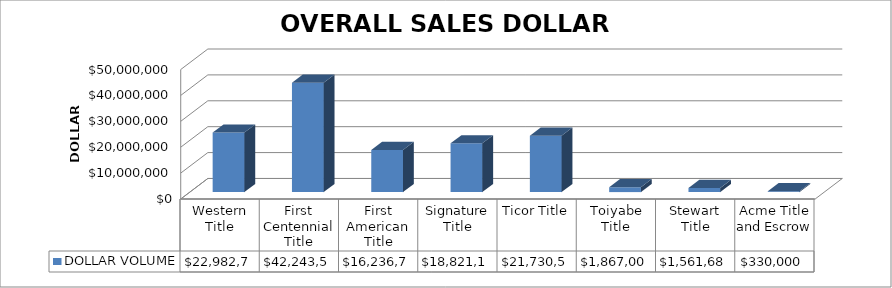
| Category | DOLLAR VOLUME |
|---|---|
| Western Title | 22982786 |
| First Centennial Title | 42243500 |
| First American Title | 16236707 |
| Signature Title | 18821140 |
| Ticor Title | 21730500 |
| Toiyabe Title | 1867000 |
| Stewart Title | 1561685 |
| Acme Title and Escrow | 330000 |